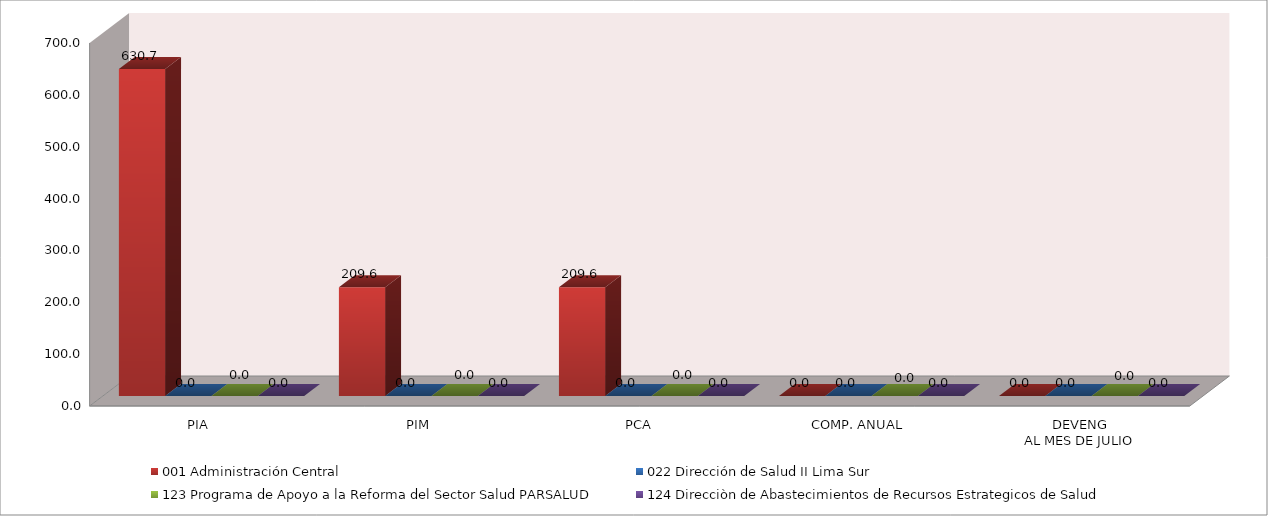
| Category | 001 Administración Central | 022 Dirección de Salud II Lima Sur | 123 Programa de Apoyo a la Reforma del Sector Salud PARSALUD | 124 Direcciòn de Abastecimientos de Recursos Estrategicos de Salud |
|---|---|---|---|---|
| PIA | 630.715 | 0 | 0 | 0 |
| PIM | 209.595 | 0 | 0 | 0 |
| PCA | 209.595 | 0 | 0 | 0 |
| COMP. ANUAL | 0 | 0 | 0 | 0 |
| DEVENG
AL MES DE JULIO | 0 | 0 | 0 | 0 |